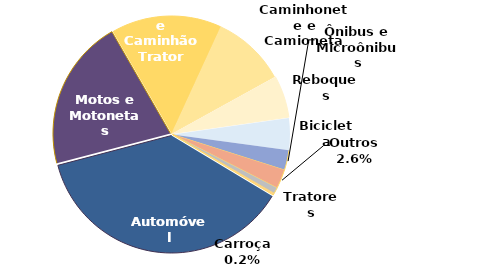
| Category | Qtde |
|---|---|
| Automóvel | 912 |
| Motos e Motonetas | 508 |
| Caminhão e Caminhão Trator | 371 |
| Caminhonete e Camioneta | 247 |
| Reboques | 142 |
| Bicicleta | 107 |
| Ônibus e Microônibus | 67 |
| Outros | 64 |
| Tratores | 21 |
| Carroça | 6 |